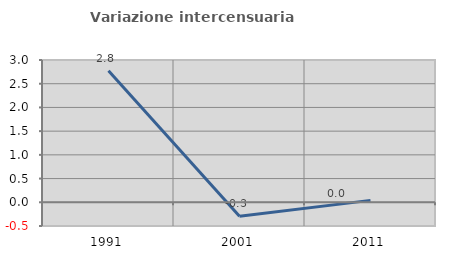
| Category | Variazione intercensuaria annua |
|---|---|
| 1991.0 | 2.771 |
| 2001.0 | -0.295 |
| 2011.0 | 0.04 |